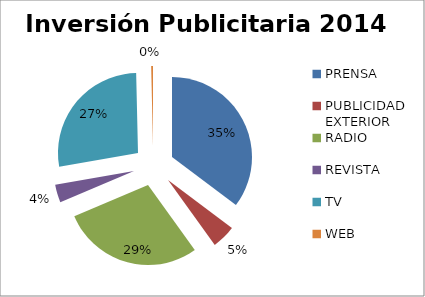
| Category | Series 0 |
|---|---|
| PRENSA | 1115636266 |
| PUBLICIDAD EXTERIOR | 151631421 |
| RADIO | 904177595 |
| REVISTA | 113736000 |
| TV | 866760209 |
| WEB | 11608070 |